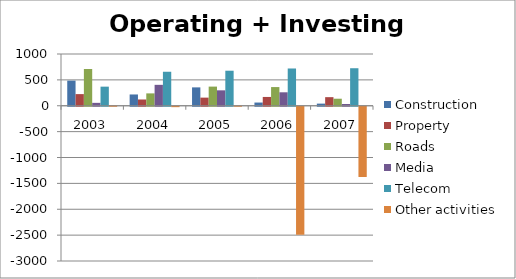
| Category | Construction | Property | Roads | Media | Telecom | Other activities |
|---|---|---|---|---|---|---|
| 2003.0 | 485 | 225 | 710 | 56 | 369 | 8 |
| 2004.0 | 218 | 121 | 239 | 404 | 657 | -8 |
| 2005.0 | 355 | 157 | 370 | 298 | 677 | 4 |
| 2006.0 | 62 | 170 | 361 | 260 | 720 | -2473 |
| 2007.0 | 41 | 166 | 136 | 34 | 725 | -1357 |